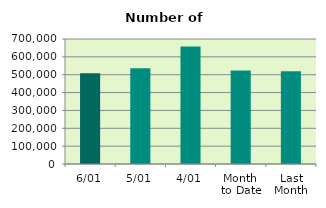
| Category | Series 0 |
|---|---|
| 6/01 | 508764 |
| 5/01 | 536108 |
| 4/01 | 657904 |
| Month 
to Date | 522983.6 |
| Last
Month | 519611.714 |